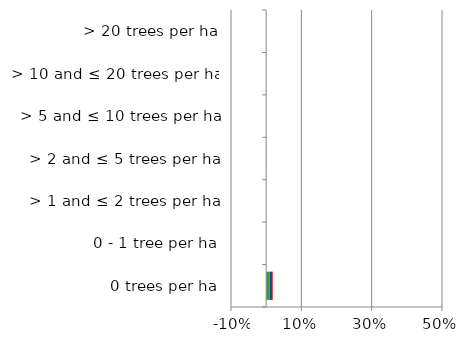
| Category | England | Scotland | Wales |
|---|---|---|---|
| 0 trees per ha | 0.01 | 0.007 | 0.002 |
| 0 - 1 tree per ha | 0 | 0 | 0 |
| > 1 and ≤ 2 trees per ha | 0 | 0 | 0 |
| > 2 and ≤ 5 trees per ha | 0 | 0 | 0 |
| > 5 and ≤ 10 trees per ha | 0 | 0 | 0 |
| > 10 and ≤ 20 trees per ha | 0 | 0 | 0 |
| > 20 trees per ha | 0 | 0 | 0 |